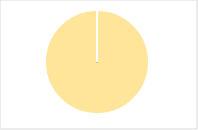
| Category | Total |
|---|---|
| Y | 0 |
| R | 0 |
| T | 0 |
| M | 0 |
| F | 0 |
| N | 24 |